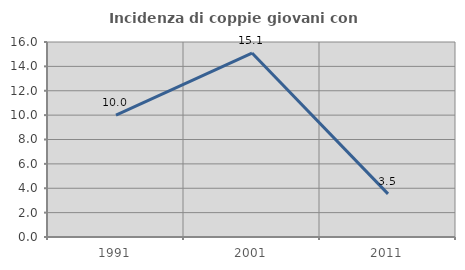
| Category | Incidenza di coppie giovani con figli |
|---|---|
| 1991.0 | 10 |
| 2001.0 | 15.094 |
| 2011.0 | 3.535 |